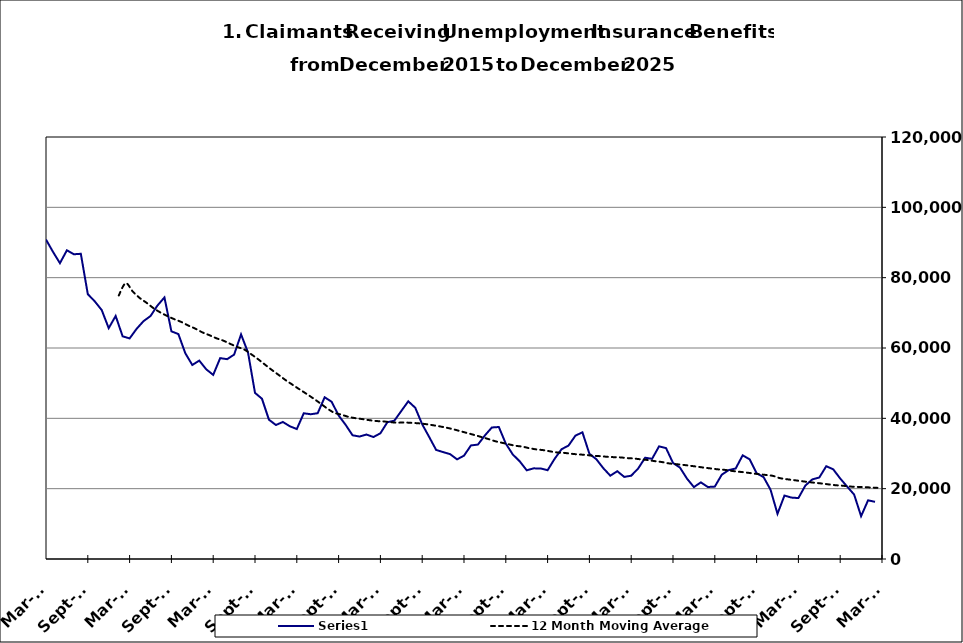
| Category | Series 0 |
|---|---|
| 2000-01-31 | 15239 |
| 2000-02-29 | 13995 |
| 2000-03-31 | 14536 |
| 2000-04-30 | 18337 |
| 2000-05-31 | 20863 |
| 2000-06-30 | 24310 |
| 2000-07-31 | 29359 |
| 2000-08-31 | 29764 |
| 2000-09-30 | 24540 |
| 2000-10-31 | 23067 |
| 2000-11-30 | 21129 |
| 2000-12-31 | 20288 |
| 2001-01-31 | 23646 |
| 2001-02-28 | 23782 |
| 2001-03-31 | 27047 |
| 2001-04-30 | 34048 |
| 2001-05-31 | 38168 |
| 2001-06-30 | 41894 |
| 2001-07-31 | 48114 |
| 2001-08-31 | 47646 |
| 2001-09-30 | 44132 |
| 2001-10-31 | 44465 |
| 2001-11-30 | 45928 |
| 2001-12-31 | 48930 |
| 2002-01-31 | 51864 |
| 2002-02-28 | 50778 |
| 2002-03-31 | 53014 |
| 2002-04-30 | 65394 |
| 2002-05-31 | 67925 |
| 2002-06-30 | 68727 |
| 2002-07-31 | 67269 |
| 2002-08-31 | 64233 |
| 2002-09-30 | 59955 |
| 2002-10-31 | 55535 |
| 2002-11-30 | 52233 |
| 2002-12-31 | 52252 |
| 2003-01-31 | 52694 |
| 2003-02-28 | 52578 |
| 2003-03-31 | 56236 |
| 2003-04-30 | 61020 |
| 2003-05-31 | 60584 |
| 2003-06-30 | 64980 |
| 2003-07-31 | 66426 |
| 2003-08-31 | 65403 |
| 2003-09-30 | 58348 |
| 2003-10-31 | 53953 |
| 2003-11-30 | 50453 |
| 2003-12-31 | 47799 |
| 2004-01-31 | 47134 |
| 2004-02-29 | 42441 |
| 2004-03-31 | 39363 |
| 2004-04-30 | 41157 |
| 2004-05-31 | 40892 |
| 2004-06-30 | 43601 |
| 2004-07-31 | 45411 |
| 2004-08-31 | 44738 |
| 2004-09-30 | 36049 |
| 2004-10-31 | 33551 |
| 2004-11-30 | 31386 |
| 2004-12-31 | 30195 |
| 2005-01-31 | 31661 |
| 2005-02-28 | 28205 |
| 2005-03-31 | 28194 |
| 2005-04-30 | 31233 |
| 2005-05-31 | 24184 |
| 2005-06-30 | 33525 |
| 2005-07-31 | 35776 |
| 2005-08-31 | 33297 |
| 2005-09-30 | 27423 |
| 2005-10-31 | 25647 |
| 2005-11-30 | 21039 |
| 2005-12-31 | 21238 |
| 2006-01-31 | 22270 |
| 2006-02-28 | 19689 |
| 2006-03-31 | 19474 |
| 2006-04-30 | 22420 |
| 2006-05-31 | 24146 |
| 2006-06-30 | 26450 |
| 2006-07-31 | 30575 |
| 2006-08-31 | 30038 |
| 2006-09-30 | 25657 |
| 2006-10-31 | 24869 |
| 2006-11-30 | 22832 |
| 2006-12-31 | 22826 |
| 2007-01-31 | 24459 |
| 2007-02-28 | 23856 |
| 2007-03-31 | 24786 |
| 2007-04-30 | 29690 |
| 2007-05-31 | 31303 |
| 2007-06-30 | 33512 |
| 2007-07-31 | 39176 |
| 2007-08-31 | 37077 |
| 2007-09-30 | 34179 |
| 2007-10-31 | 32130 |
| 2007-11-15 | 31205 |
| 2007-12-15 09:36:00 | 31973 |
| 2008-01-14 19:12:00 | 33494 |
| 2008-02-14 04:48:00 | 34694 |
| 2008-03-15 14:24:00 | 37279 |
| 2008-04-15 | 41840 |
| 2008-05-15 09:36:00 | 44245 |
| 2008-06-14 19:12:00 | 49341 |
| 2008-07-15 04:48:00 | 53353 |
| 2008-08-14 14:24:00 | 53222 |
| 2008-09-14 | 52594 |
| 2008-10-14 09:36:00 | 51417 |
| 2008-11-13 19:12:00 | 54795 |
| 2008-12-14 04:48:00 | 64139 |
| 2009-01-13 14:24:00 | 71026 |
| 2009-02-13 | 77947 |
| 2009-03-15 09:36:00 | 90649 |
| 2009-04-14 19:12:00 | 101865 |
| 2009-05-15 04:48:00 | 105867 |
| 2009-06-14 14:24:00 | 114626 |
| 2009-07-15 | 116882 |
| 2009-08-14 09:36:00 | 117270 |
| 2009-09-13 19:12:00 | 107943 |
| 2009-10-14 04:48:00 | 104849 |
| 2009-11-13 14:24:00 | 102065 |
| 2009-12-14 | 97917 |
| 2010-01-13 09:36:00 | 98175 |
| 2010-02-12 19:12:00 | 92691 |
| 2010-03-15 04:48:00 | 90832 |
| 2010-04-14 14:24:00 | 87347 |
| 2010-05-15 | 84120 |
| 2010-06-14 09:36:00 | 87787 |
| 2010-07-14 19:12:00 | 86654 |
| 2010-08-14 04:48:00 | 86789 |
| 2010-09-13 14:24:00 | 75317 |
| 2010-10-14 | 73259 |
| 2010-11-13 09:36:00 | 70783 |
| 2010-12-13 19:12:00 | 65644 |
| 2011-01-13 04:48:00 | 69106 |
| 2011-02-12 14:24:00 | 63322 |
| 2011-03-15 | 62724 |
| 2011-04-14 09:36:00 | 65434 |
| 2011-05-14 19:12:00 | 67641 |
| 2011-06-14 04:48:00 | 69087 |
| 2011-07-14 14:24:00 | 72082 |
| 2011-08-14 | 74376 |
| 2011-09-13 09:36:00 | 64739 |
| 2011-10-13 19:12:00 | 63965 |
| 2011-11-13 04:48:00 | 58496 |
| 2011-12-13 14:24:00 | 55173 |
| 2012-01-13 | 56418 |
| 2012-02-12 09:36:00 | 53942 |
| 2012-03-13 19:12:00 | 52352 |
| 2012-04-13 04:48:00 | 57118 |
| 2012-05-13 14:24:00 | 56827 |
| 2012-06-13 | 58115 |
| 2012-07-13 09:36:00 | 63863 |
| 2012-08-12 19:12:00 | 58706 |
| 2012-09-12 04:48:00 | 47243 |
| 2012-10-12 14:24:00 | 45567 |
| 2012-11-12 | 39623 |
| 2012-12-12 09:36:00 | 38101 |
| 2013-01-11 19:12:00 | 38966 |
| 2013-02-11 04:48:00 | 37746 |
| 2013-03-13 14:24:00 | 36956 |
| 2013-04-13 | 41439 |
| 2013-05-13 09:36:00 | 41162 |
| 2013-06-12 19:12:00 | 41455 |
| 2013-07-13 04:48:00 | 45989 |
| 2013-08-12 14:24:00 | 44712 |
| 2013-09-12 | 40828 |
| 2013-10-12 09:36:00 | 38185 |
| 2013-11-11 19:12:00 | 35184 |
| 2013-12-12 04:48:00 | 34824 |
| 2014-01-11 14:24:00 | 35396 |
| 2014-02-11 | 34683 |
| 2014-03-13 09:36:00 | 35748 |
| 2014-04-12 19:12:00 | 38892 |
| 2014-05-13 04:48:00 | 39325 |
| 2014-06-12 14:24:00 | 42091 |
| 2014-07-13 | 44842 |
| 2014-08-14 | 43016 |
| 2014-09-13 09:36:00 | 38304 |
| 2014-10-13 19:12:00 | 34708 |
| 2014-11-13 04:48:00 | 31017 |
| 2014-12-13 14:24:00 | 30402 |
| 2015-01-13 | 29823 |
| 2015-02-12 09:36:00 | 28333 |
| 2015-03-14 19:12:00 | 29389 |
| 2015-04-14 04:48:00 | 32293 |
| 2015-05-14 14:24:00 | 32538 |
| 2015-06-14 | 35137 |
| 2015-07-14 09:36:00 | 37398 |
| 2015-08-13 19:12:00 | 37536 |
| 2015-09-13 04:48:00 | 32808 |
| 2015-10-13 14:24:00 | 29728 |
| 2015-11-13 | 27775 |
| 2015-12-13 09:36:00 | 25227 |
| 2016-01-12 19:12:00 | 25773 |
| 2016-02-12 04:48:00 | 25758 |
| 2016-03-13 14:24:00 | 25247 |
| 2016-04-13 | 28463 |
| 2016-05-13 09:36:00 | 31210 |
| 2016-06-12 19:12:00 | 32255 |
| 2016-07-13 04:48:00 | 35088 |
| 2016-08-12 14:24:00 | 36018 |
| 2016-09-12 | 29922 |
| 2016-10-12 09:36:00 | 28368 |
| 2016-11-11 19:12:00 | 25818 |
| 2016-12-12 04:48:00 | 23690 |
| 2017-01-11 14:24:00 | 24964 |
| 2017-02-11 | 23348 |
| 2017-03-13 09:36:00 | 23685 |
| 2017-04-12 19:12:00 | 25733 |
| 2017-05-13 04:48:00 | 28796 |
| 2017-06-12 14:24:00 | 28489 |
| 2017-07-13 | 32034 |
| 2017-08-12 09:36:00 | 31539 |
| 2017-09-11 19:12:00 | 27321 |
| 2017-10-12 04:48:00 | 25990 |
| 2017-11-11 14:24:00 | 22875 |
| 2017-12-12 | 20445 |
| 2018-01-11 09:36:00 | 21794 |
| 2018-02-10 19:12:00 | 20475 |
| 2018-03-13 04:48:00 | 20585 |
| 2018-04-12 14:24:00 | 23969 |
| 2018-05-13 | 25280 |
| 2018-06-12 09:36:00 | 25741 |
| 2018-07-12 19:12:00 | 29479 |
| 2018-08-12 04:48:00 | 28351 |
| 2018-09-11 14:24:00 | 24386 |
| 2018-10-12 | 23292 |
| 2018-11-11 09:36:00 | 19711 |
| 2018-12-11 19:12:00 | 12853 |
| 2019-01-11 04:48:00 | 18039 |
| 2019-02-10 14:24:00 | 17466 |
| 2019-03-13 | 17325 |
| 2019-04-12 09:36:00 | 20890 |
| 2019-05-12 19:12:00 | 22641 |
| 2019-06-12 04:48:00 | 23178 |
| 2019-07-12 14:24:00 | 26385 |
| 2019-08-12 | 25501 |
| 2019-09-11 09:36:00 | 22892 |
| 2019-10-11 19:12:00 | 20585 |
| 2019-11-11 04:48:00 | 18323 |
| 2019-12-11 14:24:00 | 12174 |
| 2020-01-11 | 16683 |
| 2020-02-10 09:36:00 | 16260 |
| 2020-03-11 19:12:00 | 21695 |